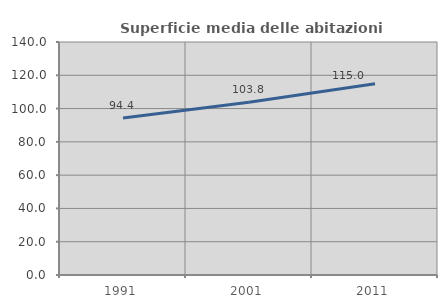
| Category | Superficie media delle abitazioni occupate |
|---|---|
| 1991.0 | 94.35 |
| 2001.0 | 103.812 |
| 2011.0 | 114.958 |